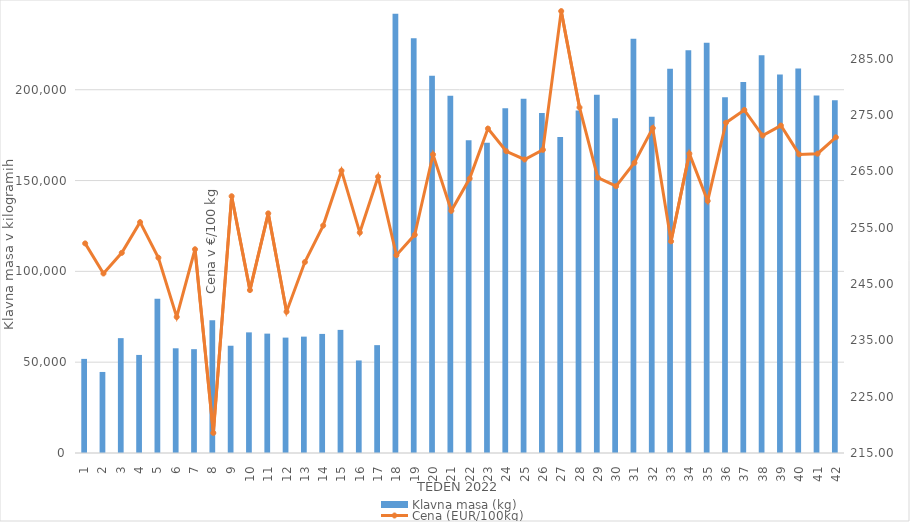
| Category | Klavna masa (kg) |
|---|---|
| 1.0 | 51818 |
| 2.0 | 44619 |
| 3.0 | 63233 |
| 4.0 | 53993 |
| 5.0 | 84871 |
| 6.0 | 57648 |
| 7.0 | 57159 |
| 8.0 | 73139 |
| 9.0 | 59056 |
| 10.0 | 66417 |
| 11.0 | 65723 |
| 12.0 | 63530 |
| 13.0 | 64069 |
| 14.0 | 65564 |
| 15.0 | 67787 |
| 16.0 | 50958 |
| 17.0 | 59387 |
| 18.0 | 241833 |
| 19.0 | 228389 |
| 20.0 | 207661 |
| 21.0 | 196732 |
| 22.0 | 172190 |
| 23.0 | 170751 |
| 24.0 | 189775 |
| 25.0 | 195029 |
| 26.0 | 187239 |
| 27.0 | 173967 |
| 28.0 | 188601 |
| 29.0 | 197293 |
| 30.0 | 184259 |
| 31.0 | 228023 |
| 32.0 | 185079 |
| 33.0 | 211612 |
| 34.0 | 221748 |
| 35.0 | 225927 |
| 36.0 | 195924 |
| 37.0 | 204224 |
| 38.0 | 218966 |
| 39.0 | 208403 |
| 40.0 | 211635 |
| 41.0 | 196841 |
| 42.0 | 194271 |